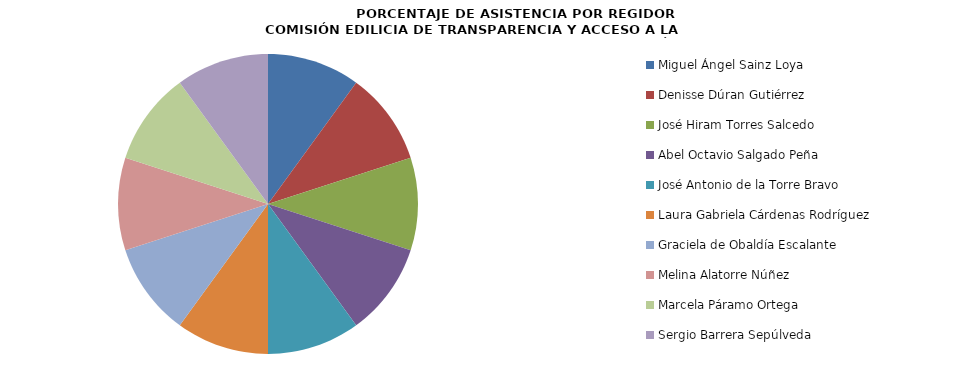
| Category | Series 0 |
|---|---|
| Miguel Ángel Sainz Loya | 100 |
| Denisse Dúran Gutiérrez | 100 |
| José Hiram Torres Salcedo | 100 |
| Abel Octavio Salgado Peña | 100 |
| José Antonio de la Torre Bravo | 100 |
| Laura Gabriela Cárdenas Rodríguez | 100 |
| Graciela de Obaldía Escalante | 100 |
| Melina Alatorre Núñez | 100 |
| Marcela Páramo Ortega | 100 |
| Sergio Barrera Sepúlveda | 100 |